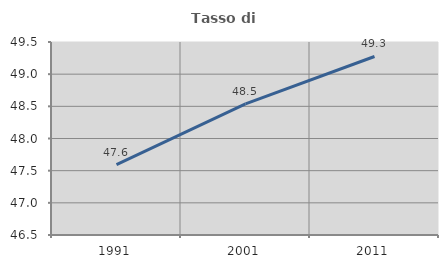
| Category | Tasso di occupazione   |
|---|---|
| 1991.0 | 47.593 |
| 2001.0 | 48.538 |
| 2011.0 | 49.275 |